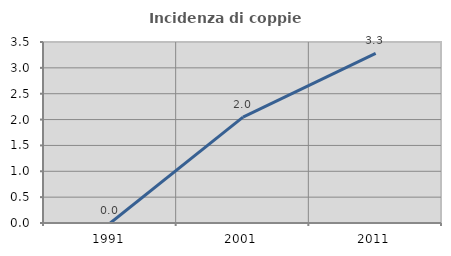
| Category | Incidenza di coppie miste |
|---|---|
| 1991.0 | 0 |
| 2001.0 | 2.047 |
| 2011.0 | 3.279 |